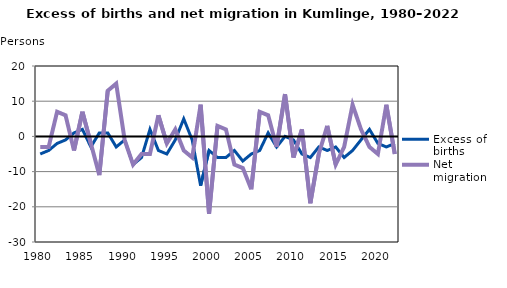
| Category | Excess of births | Net migration |
|---|---|---|
| 1980.0 | -5 | -3 |
| 1981.0 | -4 | -3 |
| 1982.0 | -2 | 7 |
| 1983.0 | -1 | 6 |
| 1984.0 | 1 | -4 |
| 1985.0 | 2 | 7 |
| 1986.0 | -3 | -2 |
| 1987.0 | 1 | -11 |
| 1988.0 | 1 | 13 |
| 1989.0 | -3 | 15 |
| 1990.0 | -1 | -1 |
| 1991.0 | -8 | -8 |
| 1992.0 | -6 | -5 |
| 1993.0 | 2 | -5 |
| 1994.0 | -4 | 6 |
| 1995.0 | -5 | -2 |
| 1996.0 | -1 | 2 |
| 1997.0 | 5 | -4 |
| 1998.0 | -1 | -6 |
| 1999.0 | -14 | 9 |
| 2000.0 | -4 | -22 |
| 2001.0 | -6 | 3 |
| 2002.0 | -6 | 2 |
| 2003.0 | -4 | -8 |
| 2004.0 | -7 | -9 |
| 2005.0 | -5 | -15 |
| 2006.0 | -4 | 7 |
| 2007.0 | 1 | 6 |
| 2008.0 | -3 | -3 |
| 2009.0 | 0 | 12 |
| 2010.0 | -1 | -6 |
| 2011.0 | -5 | 2 |
| 2012.0 | -6 | -19 |
| 2013.0 | -3 | -5 |
| 2014.0 | -4 | 3 |
| 2015.0 | -3 | -8 |
| 2016.0 | -6 | -3 |
| 2017.0 | -4 | 9 |
| 2018.0 | -1 | 2 |
| 2019.0 | 2 | -3 |
| 2020.0 | -2 | -5 |
| 2021.0 | -3 | 9 |
| 2022.0 | -2 | -5 |